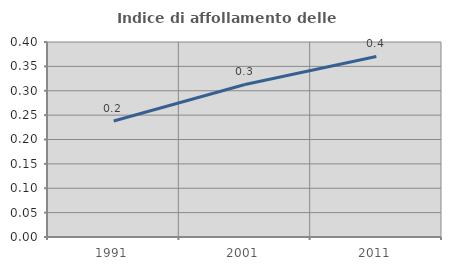
| Category | Indice di affollamento delle abitazioni  |
|---|---|
| 1991.0 | 0.238 |
| 2001.0 | 0.313 |
| 2011.0 | 0.37 |